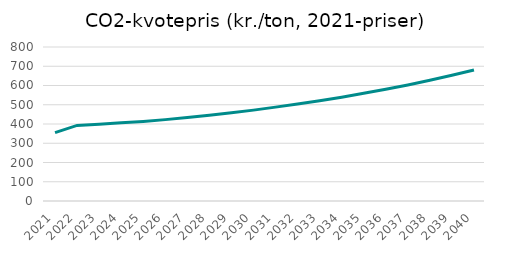
| Category | Series 0 |
|---|---|
| 2021.0 | 355 |
| 2022.0 | 392.644 |
| 2023.0 | 399.012 |
| 2024.0 | 406.231 |
| 2025.0 | 413.417 |
| 2026.0 | 422.748 |
| 2027.0 | 434.23 |
| 2028.0 | 445.994 |
| 2029.0 | 458.906 |
| 2030.0 | 472.095 |
| 2031.0 | 487.726 |
| 2032.0 | 503.638 |
| 2033.0 | 521.057 |
| 2034.0 | 539.229 |
| 2035.0 | 559.708 |
| 2036.0 | 580.793 |
| 2037.0 | 603.065 |
| 2038.0 | 627.11 |
| 2039.0 | 652.794 |
| 2040.0 | 680.875 |